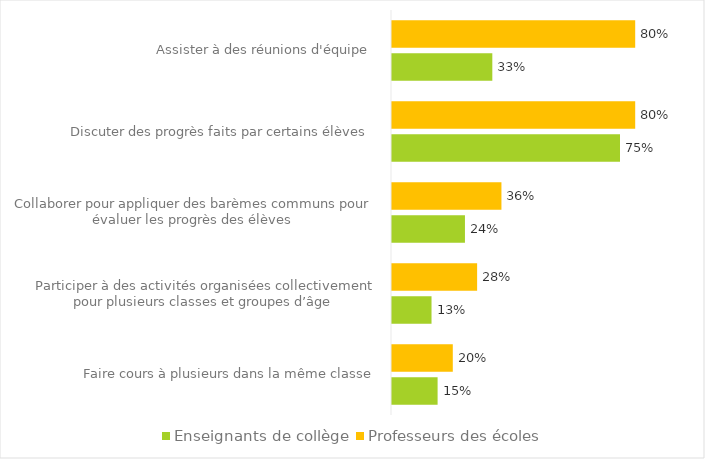
| Category | Enseignants de collège | Professeurs des écoles |
|---|---|---|
| Faire cours à plusieurs dans la même classe | 0.15 | 0.2 |
| Participer à des activités organisées collectivement pour plusieurs classes et groupes d’âge  | 0.13 | 0.28 |
| Collaborer pour appliquer des barèmes communs pour évaluer les progrès des élèves  | 0.24 | 0.36 |
| Discuter des progrès faits par certains élèves  | 0.75 | 0.8 |
| Assister à des réunions d'équipe  | 0.33 | 0.8 |